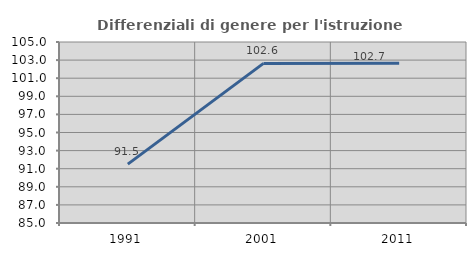
| Category | Differenziali di genere per l'istruzione superiore |
|---|---|
| 1991.0 | 91.507 |
| 2001.0 | 102.637 |
| 2011.0 | 102.655 |